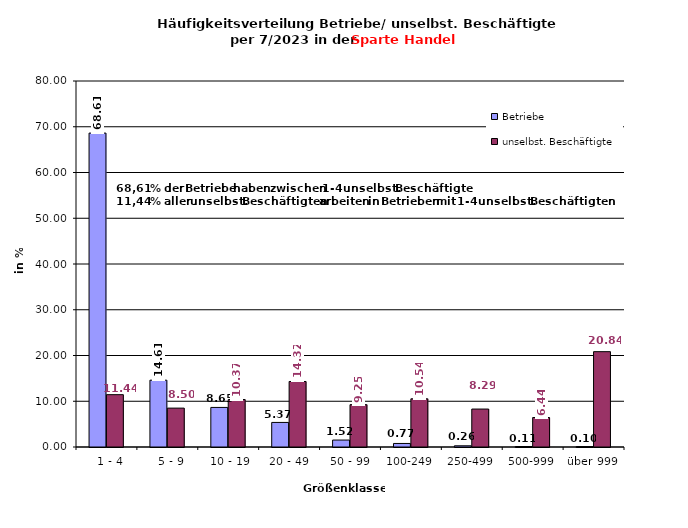
| Category | Betriebe | unselbst. Beschäftigte |
|---|---|---|
|   1 - 4 | 68.614 | 11.441 |
|   5 - 9 | 14.607 | 8.498 |
|  10 - 19 | 8.649 | 10.373 |
| 20 - 49 | 5.371 | 14.32 |
| 50 - 99 | 1.516 | 9.255 |
| 100-249 | 0.773 | 10.535 |
| 250-499 | 0.264 | 8.295 |
| 500-999 | 0.108 | 6.443 |
| über 999 | 0.098 | 20.84 |